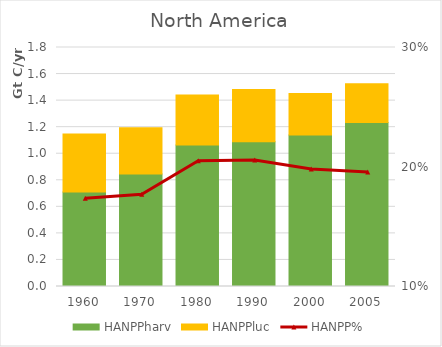
| Category | HANPPharv | HANPPluc |
|---|---|---|
| 1960.0 | 712028.977 | 437246.712 |
| 1970.0 | 847785.576 | 347592.455 |
| 1980.0 | 1065941.416 | 377173.55 |
| 1990.0 | 1089845.27 | 394421.035 |
| 2000.0 | 1140474.734 | 313029.413 |
| 2005.0 | 1234765.807 | 292078.364 |